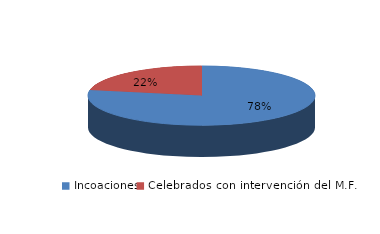
| Category | Series 0 |
|---|---|
| Incoaciones | 8038 |
| Celebrados con intervención del M.F. | 2267 |